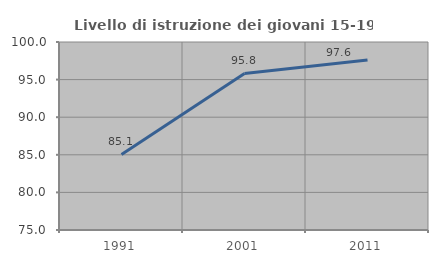
| Category | Livello di istruzione dei giovani 15-19 anni |
|---|---|
| 1991.0 | 85.054 |
| 2001.0 | 95.813 |
| 2011.0 | 97.616 |